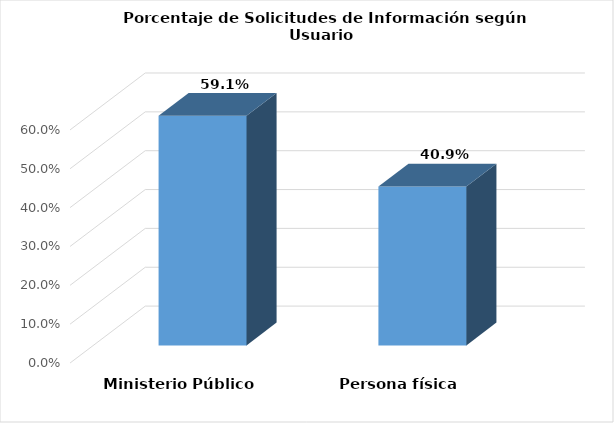
| Category | Series 0 |
|---|---|
| Ministerio Público | 0.591 |
| Persona física | 0.409 |